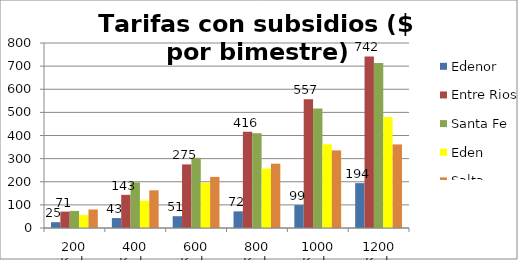
| Category | Edenor | Entre Rios | Santa Fe | Eden | Salta |
|---|---|---|---|---|---|
| 200 Kwh | 25 | 70.96 | 73.92 | 56 | 80 |
| 400 Kwh  | 43 | 143.38 | 197.04 | 118 | 163 |
| 600 Kwh  | 51 | 275 | 303.51 | 195.36 | 221 |
| 800 Kwh | 72 | 415.74 | 409.98 | 257 | 278 |
| 1000 Kwh  | 99 | 556.66 | 516.46 | 362 | 335.7 |
| 1200 Kwh | 194 | 742 | 713.61 | 480 | 361.41 |